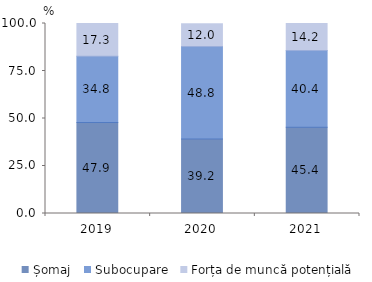
| Category | Șomaj | Subocupare | Forța de muncă potențială |
|---|---|---|---|
| 2019.0 | 47.906 | 34.831 | 17.263 |
| 2020.0 | 39.172 | 48.757 | 12 |
| 2021.0 | 45.411 | 40.419 | 14.171 |